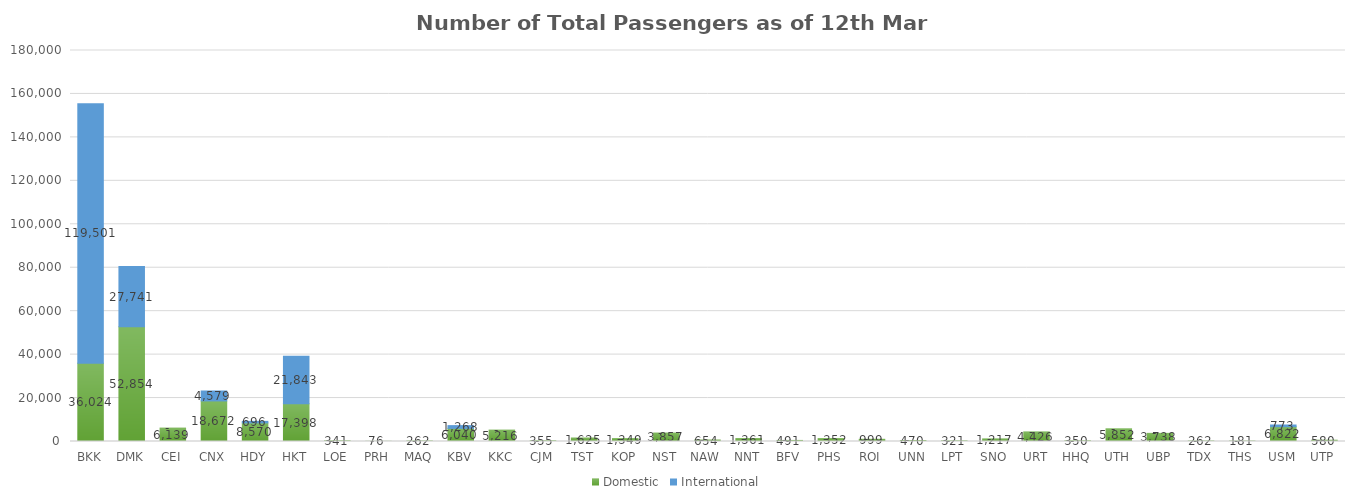
| Category | Domestic | International |
|---|---|---|
| BKK | 36024 | 119501 |
| DMK | 52854 | 27741 |
| CEI | 6139 | 0 |
| CNX | 18672 | 4579 |
| HDY | 8570 | 696 |
| HKT | 17398 | 21843 |
| LOE | 341 | 0 |
| PRH | 76 | 0 |
| MAQ | 262 | 0 |
| KBV | 6040 | 1268 |
| KKC | 5216 | 0 |
| CJM | 355 | 0 |
| TST | 1625 | 0 |
| KOP | 1349 | 0 |
| NST | 3857 | 0 |
| NAW | 654 | 0 |
| NNT | 1361 | 0 |
| BFV | 491 | 0 |
| PHS | 1352 | 0 |
| ROI | 999 | 0 |
| UNN | 470 | 0 |
| LPT | 321 | 0 |
| SNO | 1217 | 0 |
| URT | 4426 | 0 |
| HHQ | 350 | 0 |
| UTH | 5852 | 0 |
| UBP | 3738 | 0 |
| TDX | 262 | 0 |
| THS | 181 | 0 |
| USM | 6822 | 773 |
| UTP | 580 | 0 |